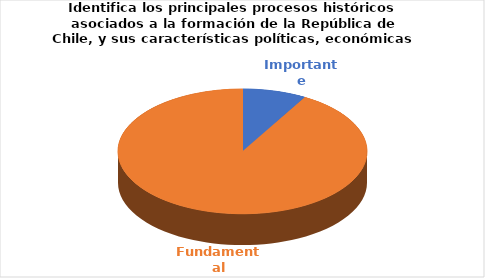
| Category | Series 0 |
|---|---|
| Importante | 1 |
| Fundamental | 11 |